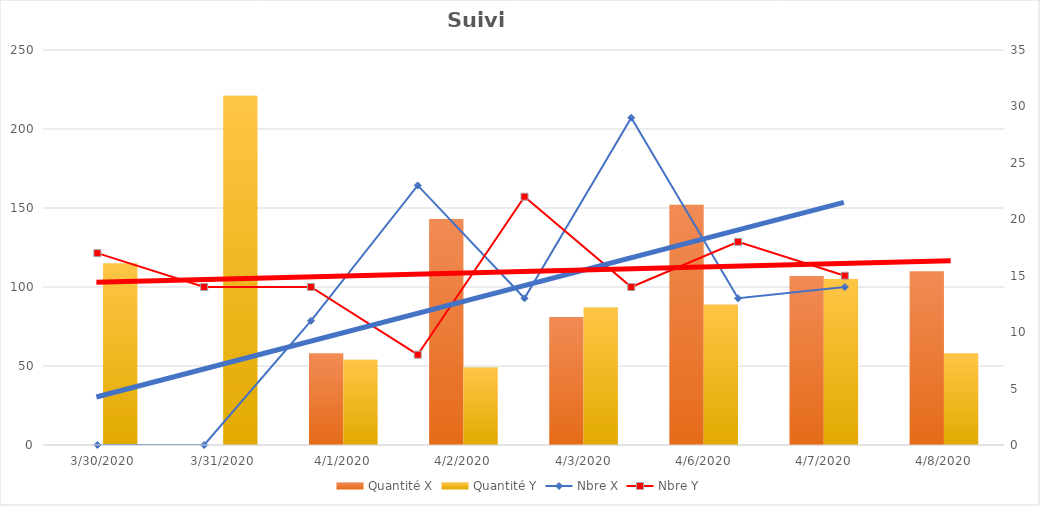
| Category | Quantité X | Quantité Y |
|---|---|---|
| 3/30/20 | 0 | 115 |
| 3/31/20 | 0 | 221 |
| 4/1/20 | 58 | 54 |
| 4/2/20 | 143 | 49 |
| 4/3/20 | 81 | 87 |
| 4/6/20 | 152 | 89 |
| 4/7/20 | 107 | 105 |
| 4/8/20 | 110 | 58 |